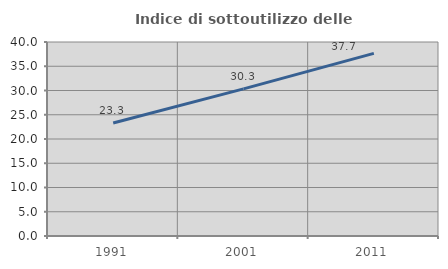
| Category | Indice di sottoutilizzo delle abitazioni  |
|---|---|
| 1991.0 | 23.301 |
| 2001.0 | 30.342 |
| 2011.0 | 37.652 |